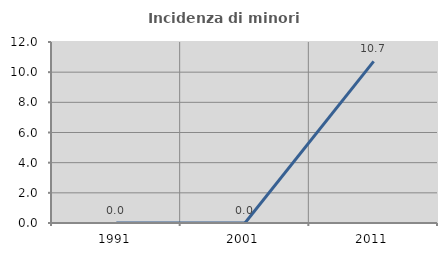
| Category | Incidenza di minori stranieri |
|---|---|
| 1991.0 | 0 |
| 2001.0 | 0 |
| 2011.0 | 10.714 |